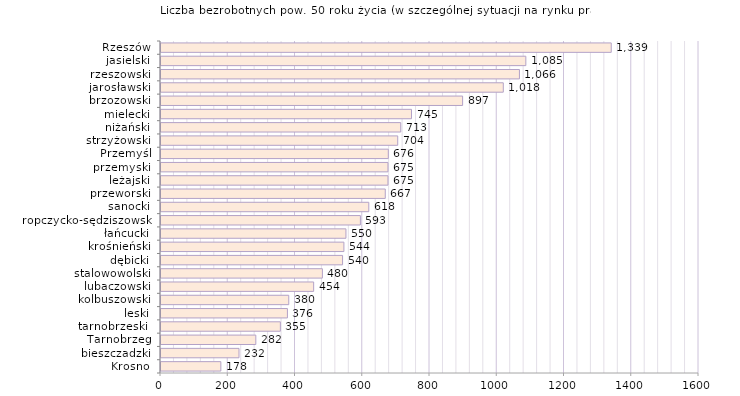
| Category | Liczba bezrobotnych powyżej 50 roku życia - w szczególnej sytuacji na rynku pracy |
|---|---|
| Krosno | 178 |
| bieszczadzki | 232 |
| Tarnobrzeg | 282 |
| tarnobrzeski  | 355 |
| leski | 376 |
| kolbuszowski | 380 |
| lubaczowski | 454 |
| stalowowolski | 480 |
| dębicki | 540 |
| krośnieński | 544 |
| łańcucki | 550 |
| ropczycko-sędziszowski | 593 |
| sanocki | 618 |
| przeworski | 667 |
| leżajski | 675 |
| przemyski | 675 |
| Przemyśl | 676 |
| strzyżowski | 704 |
| niżański | 713 |
| mielecki | 745 |
| brzozowski | 897 |
| jarosławski | 1018 |
| rzeszowski | 1066 |
| jasielski | 1085 |
| Rzeszów | 1339 |